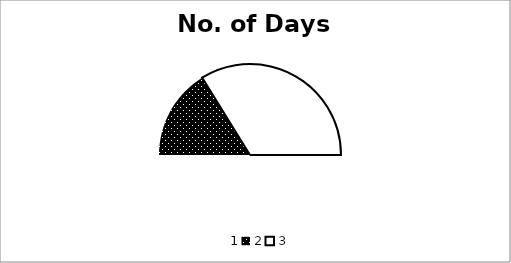
| Category | Series 0 |
|---|---|
| 0 | 68 |
| 1 | 22 |
| 2 | 46 |